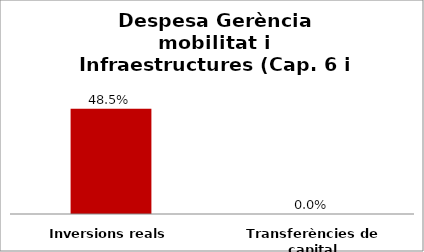
| Category | Series 0 |
|---|---|
| Inversions reals | 0.485 |
| Transferències de capital | 0 |